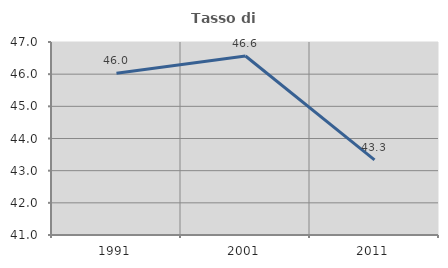
| Category | Tasso di occupazione   |
|---|---|
| 1991.0 | 46.028 |
| 2001.0 | 46.565 |
| 2011.0 | 43.333 |